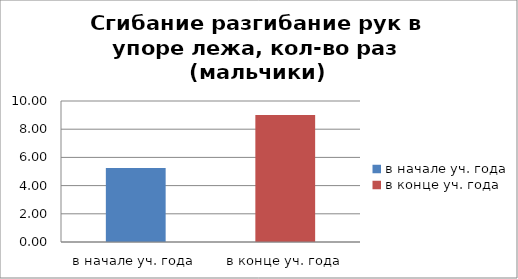
| Category | Series 0 |
|---|---|
| в начале уч. года | 5.25 |
| в конце уч. года | 9 |